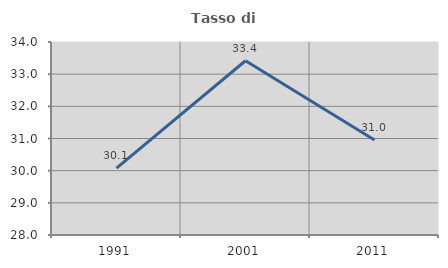
| Category | Tasso di occupazione   |
|---|---|
| 1991.0 | 30.08 |
| 2001.0 | 33.418 |
| 2011.0 | 30.952 |